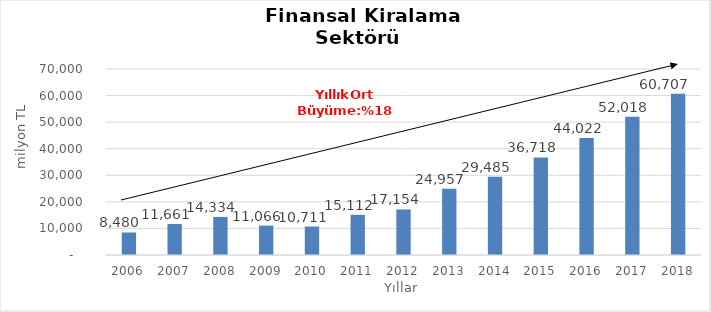
| Category | Finansal Kiralama  |
|---|---|
| 2006.0 | 8479.947 |
| 2007.0 | 11660.58 |
| 2008.0 | 14333.808 |
| 2009.0 | 11065.67 |
| 2010.0 | 10710.722 |
| 2011.0 | 15112.153 |
| 2012.0 | 17154.47 |
| 2013.0 | 24957.48 |
| 2014.0 | 29485.282 |
| 2015.0 | 36718 |
| 2016.0 | 44022 |
| 2017.0 | 52018 |
| 2018.0 | 60707 |